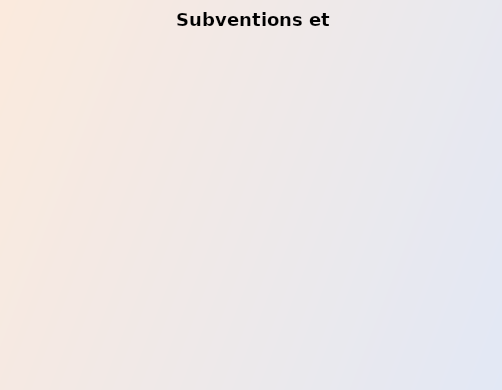
| Category | Series 0 |
|---|---|
| Politiques et procédures de gestion des subventions | 2 |
| Système de gestion des subventions | 2 |
| Développement des capacités des sous-bénéficiaires de subvention | 3.3 |